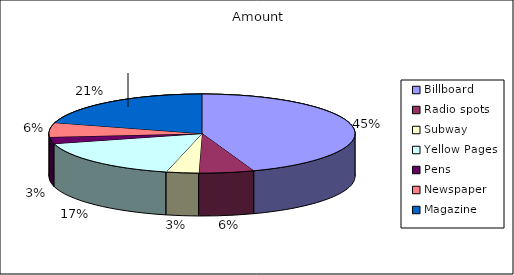
| Category | Amount |
|---|---|
| Billboard | 6500 |
| Radio spots | 850 |
| Subway | 500 |
| Yellow Pages | 2500 |
| Pens | 400 |
| Newspaper | 850 |
| Magazine | 3000 |